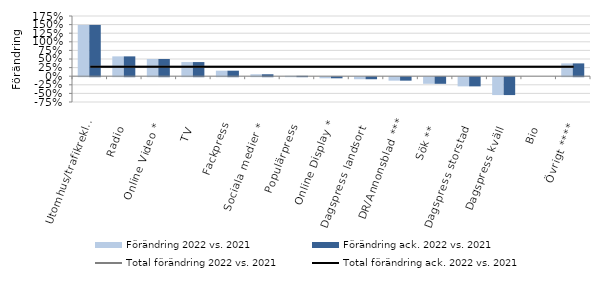
| Category | Förändring 2022 vs. 2021 | Förändring ack. 2022 vs. 2021 |
|---|---|---|
| Utomhus/trafikreklam | 1.491 | 1.491 |
| Radio | 0.576 | 0.576 |
| Online Video * | 0.499 | 0.499 |
| TV | 0.411 | 0.411 |
| Fackpress | 0.16 | 0.16 |
| Sociala medier * | 0.057 | 0.057 |
| Populärpress | 0.011 | 0.011 |
| Online Display * | -0.032 | -0.032 |
| Dagspress landsort  | -0.059 | -0.059 |
| DR/Annonsblad *** | -0.1 | -0.1 |
| Sök ** | -0.192 | -0.192 |
| Dagspress storstad  | -0.267 | -0.267 |
| Dagspress kväll  | -0.52 | -0.52 |
| Bio | 0 | 0 |
| Övrigt **** | 0.373 | 0.373 |